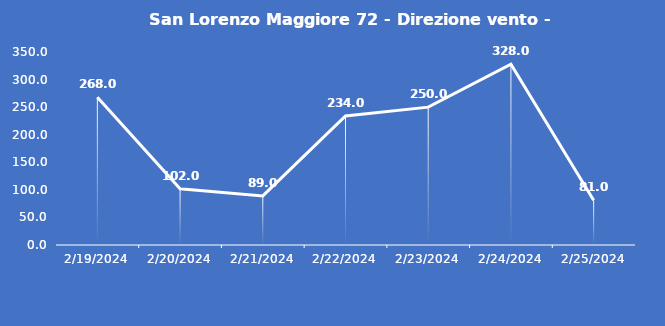
| Category | San Lorenzo Maggiore 72 - Direzione vento - Grezzo (°N) |
|---|---|
| 2/19/24 | 268 |
| 2/20/24 | 102 |
| 2/21/24 | 89 |
| 2/22/24 | 234 |
| 2/23/24 | 250 |
| 2/24/24 | 328 |
| 2/25/24 | 81 |